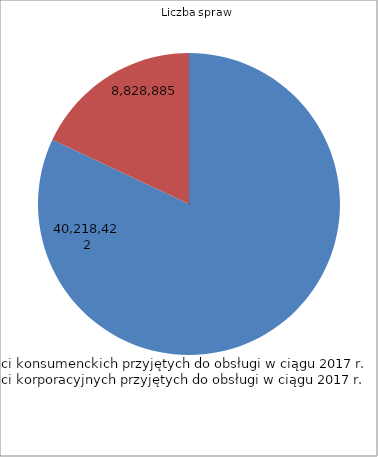
| Category | Series 0 | Series 1 |
|---|---|---|
| Liczba spraw wierzytelności konsumenckich przyjętych do obsługi w ciągu 2017 r. | 40218422 | 8657099 |
| Liczba spraw wierzytelności korporacyjnych przyjętych do obsługi w ciągu 2017 r. | 8828885 | 964497 |